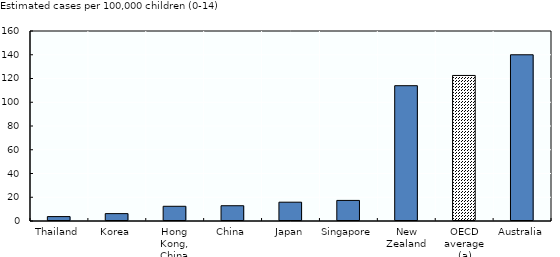
| Category | Series 1 |
|---|---|
| Thailand | 3.722 |
| Korea | 6.222 |
| Hong Kong, China | 12.389 |
| China | 12.859 |
| Japan | 15.84 |
| Singapore | 17.337 |
| New Zealand | 113.942 |
| OECD average (a) | 122.563 |
| Australia | 139.987 |